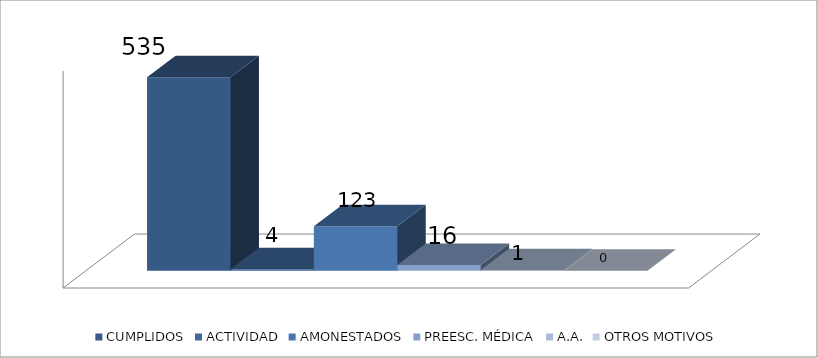
| Category | CUMPLIDOS | ACTIVIDAD | AMONESTADOS | PREESC. MÉDICA | A.A. | OTROS MOTIVOS |
|---|---|---|---|---|---|---|
| 0 | 535 | 4 | 123 | 16 | 1 | 0 |